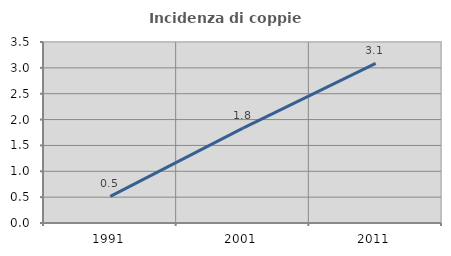
| Category | Incidenza di coppie miste |
|---|---|
| 1991.0 | 0.514 |
| 2001.0 | 1.834 |
| 2011.0 | 3.087 |